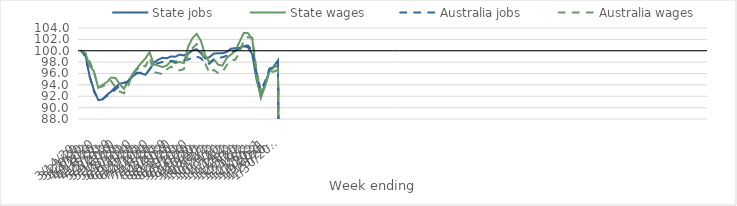
| Category | State jobs | State wages | Australia jobs | Australia wages |
|---|---|---|---|---|
| 14/03/2020 | 100 | 100 | 100 | 100 |
| 21/03/2020 | 99.335 | 99.538 | 98.956 | 99.595 |
| 28/03/2020 | 95.469 | 97.391 | 95.413 | 98.12 |
| 04/04/2020 | 93.054 | 96.344 | 92.814 | 96.244 |
| 11/04/2020 | 91.321 | 93.486 | 91.522 | 93.536 |
| 18/04/2020 | 91.447 | 94.002 | 91.5 | 93.735 |
| 25/04/2020 | 92.233 | 94.467 | 92.025 | 94.14 |
| 02/05/2020 | 92.819 | 95.3 | 92.519 | 94.693 |
| 09/05/2020 | 93.584 | 95.209 | 93.198 | 93.616 |
| 16/05/2020 | 94.2 | 94.18 | 93.788 | 92.845 |
| 23/05/2020 | 94.379 | 93.304 | 94.146 | 92.504 |
| 30/05/2020 | 94.639 | 94.662 | 94.65 | 93.808 |
| 06/06/2020 | 95.471 | 95.879 | 95.634 | 95.987 |
| 13/06/2020 | 96.032 | 96.875 | 96.135 | 96.641 |
| 20/06/2020 | 96.033 | 97.81 | 96.154 | 97.544 |
| 27/06/2020 | 95.774 | 98.621 | 95.728 | 97.236 |
| 04/07/2020 | 96.703 | 99.74 | 96.767 | 98.815 |
| 11/07/2020 | 97.923 | 97.596 | 97.729 | 96.243 |
| 18/07/2020 | 98.421 | 97.394 | 97.82 | 96.079 |
| 25/07/2020 | 98.765 | 97.125 | 98.028 | 95.887 |
| 01/08/2020 | 98.676 | 97.418 | 98.238 | 96.723 |
| 08/08/2020 | 98.984 | 98.138 | 98.223 | 97.204 |
| 15/08/2020 | 98.958 | 97.821 | 98.112 | 96.712 |
| 22/08/2020 | 99.31 | 98.03 | 98.158 | 96.554 |
| 29/08/2020 | 99.188 | 97.832 | 98.287 | 96.77 |
| 05/09/2020 | 99.479 | 100.676 | 98.443 | 99.477 |
| 12/09/2020 | 100.074 | 102.223 | 98.829 | 100.444 |
| 19/09/2020 | 100.262 | 102.978 | 98.97 | 101.162 |
| 26/09/2020 | 99.534 | 101.739 | 98.7 | 100.248 |
| 03/10/2020 | 98.655 | 99.165 | 97.765 | 97.757 |
| 10/10/2020 | 98.877 | 97.946 | 97.711 | 96.071 |
| 17/10/2020 | 99.497 | 98.505 | 98.435 | 96.645 |
| 24/10/2020 | 99.56 | 97.558 | 98.68 | 96.08 |
| 31/10/2020 | 99.556 | 97.38 | 98.863 | 96.206 |
| 07/11/2020 | 99.768 | 98.689 | 99.129 | 97.432 |
| 14/11/2020 | 100.356 | 99.328 | 99.776 | 98.33 |
| 21/11/2020 | 100.458 | 99.951 | 100.039 | 98.416 |
| 28/11/2020 | 100.499 | 101.531 | 100.264 | 99.694 |
| 05/12/2020 | 100.799 | 103.144 | 100.878 | 101.784 |
| 12/12/2020 | 100.608 | 103.094 | 100.916 | 102.402 |
| 19/12/2020 | 99.361 | 102.078 | 100.035 | 102.249 |
| 26/12/2020 | 94.927 | 95.523 | 96.089 | 96.528 |
| 02/01/2021 | 92.024 | 91.704 | 92.998 | 92.765 |
| 09/01/2021 | 94.152 | 93.816 | 94.651 | 94.062 |
| 16/01/2021 | 96.556 | 96.341 | 96.853 | 96.284 |
| 23/01/2021 | 97.218 | 97.044 | 97.109 | 96.336 |
| 30/01/2021 | 98.289 | 97.423 | 98.068 | 96.635 |